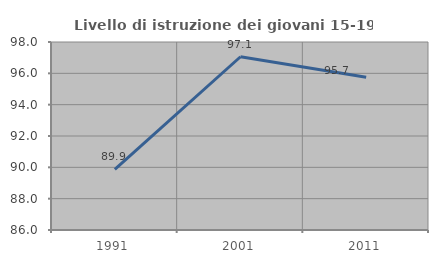
| Category | Livello di istruzione dei giovani 15-19 anni |
|---|---|
| 1991.0 | 89.873 |
| 2001.0 | 97.059 |
| 2011.0 | 95.745 |